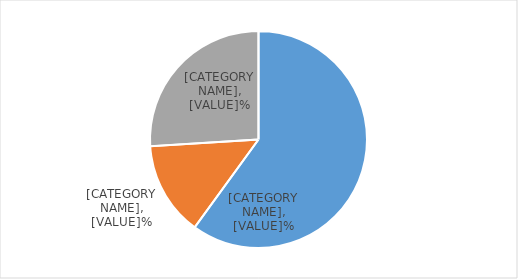
| Category | Series 0 |
|---|---|
| Undisturbed | 60 |
| Logged | 14 |
| Disturbed | 26 |